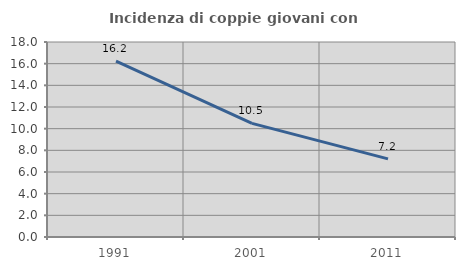
| Category | Incidenza di coppie giovani con figli |
|---|---|
| 1991.0 | 16.235 |
| 2001.0 | 10.49 |
| 2011.0 | 7.21 |